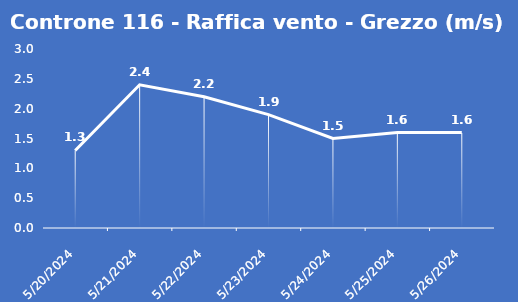
| Category | Controne 116 - Raffica vento - Grezzo (m/s) |
|---|---|
| 5/20/24 | 1.3 |
| 5/21/24 | 2.4 |
| 5/22/24 | 2.2 |
| 5/23/24 | 1.9 |
| 5/24/24 | 1.5 |
| 5/25/24 | 1.6 |
| 5/26/24 | 1.6 |